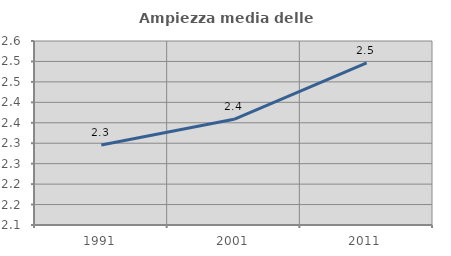
| Category | Ampiezza media delle famiglie |
|---|---|
| 1991.0 | 2.296 |
| 2001.0 | 2.358 |
| 2011.0 | 2.497 |